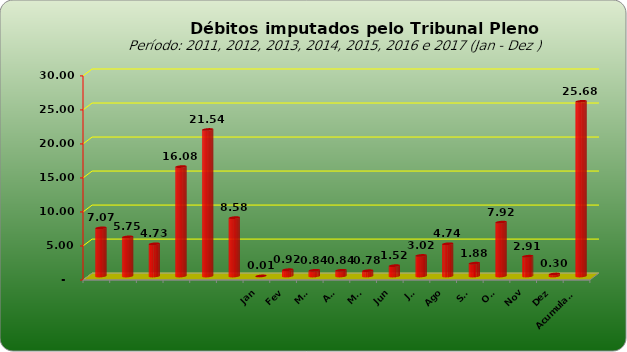
| Category |  7.073.154,74  |
|---|---|
|  | 7073154.74 |
|  | 5749129.25 |
|  | 4727033.51 |
|  | 16081820.48 |
|  | 21535723.6 |
|  | 8578266.09 |
| Jan | 7518 |
| Fev | 924330.96 |
| Mar | 840781.7 |
| Abr | 842058.28 |
| Mai | 780852.82 |
| Jun | 1521029.64 |
| Jul | 3021280.99 |
| Ago | 4735560.75 |
| Set | 1882202.79 |
| Out | 7918420.36 |
| Nov | 2906996.01 |
| Dez | 295466.87 |
| Acumulado | 25676499.17 |